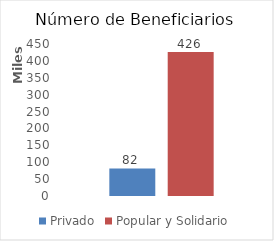
| Category | Privado | Popular y Solidario |
|---|---|---|
| 0 | 81602 | 426391 |